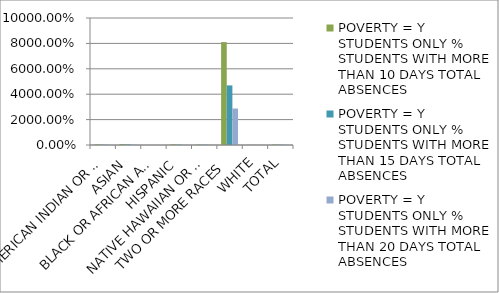
| Category | POVERTY = Y STUDENTS ONLY |
|---|---|
| AMERICAN INDIAN OR ALASKA NATIVE | 0.182 |
| ASIAN | 0.29 |
| BLACK OR AFRICAN AMERICAN | 0.003 |
| HISPANIC | 0.17 |
| NATIVE HAWAIIAN OR OTHER PACIFIC ISLANDER | 0.173 |
| TWO OR MORE RACES | 28.72 |
| WHITE | 0.065 |
| TOTAL | 0.155 |